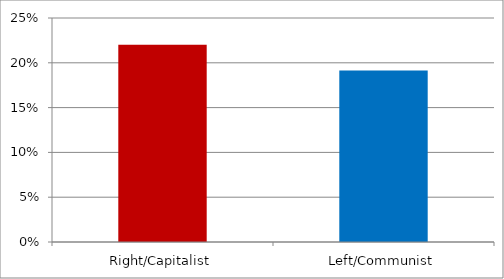
| Category | Total |
|---|---|
| Right/Capitalist | 0.22 |
| Left/Communist | 0.191 |